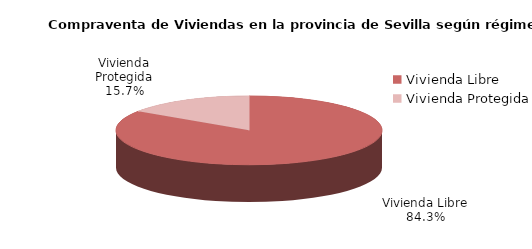
| Category | Series 0 | Series 1 |
|---|---|---|
| Vivienda Libre | 1276 | 0.843 |
| Vivienda Protegida | 237 | 0.157 |